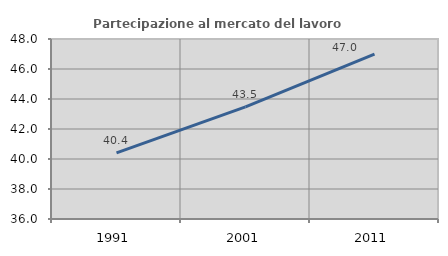
| Category | Partecipazione al mercato del lavoro  femminile |
|---|---|
| 1991.0 | 40.413 |
| 2001.0 | 43.474 |
| 2011.0 | 46.99 |